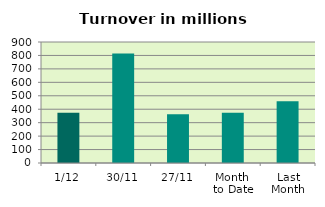
| Category | Series 0 |
|---|---|
| 1/12 | 374.291 |
| 30/11 | 814.496 |
| 27/11 | 363.472 |
| Month 
to Date | 374.291 |
| Last
Month | 459.961 |